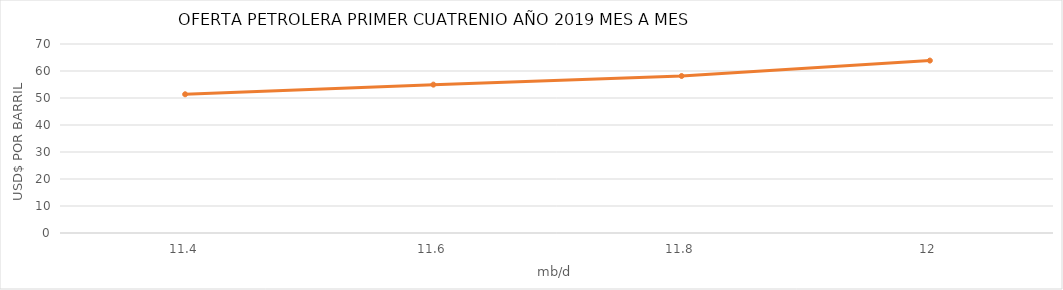
| Category | MILLONES DE BARRILES AL DÍA |
|---|---|
| 11.4 | 51.38 |
| 11.6 | 54.95 |
| 11.8 | 58.15 |
| 12.0 | 63.86 |